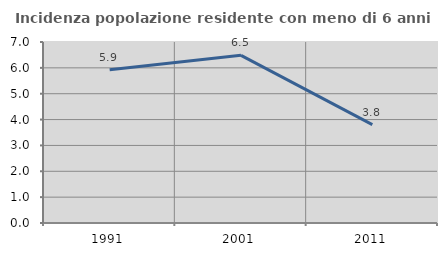
| Category | Incidenza popolazione residente con meno di 6 anni |
|---|---|
| 1991.0 | 5.929 |
| 2001.0 | 6.483 |
| 2011.0 | 3.803 |